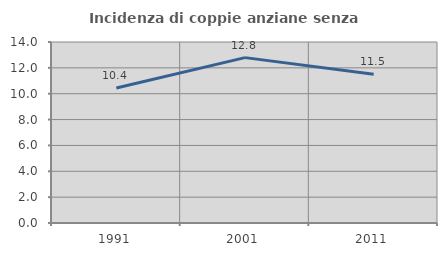
| Category | Incidenza di coppie anziane senza figli  |
|---|---|
| 1991.0 | 10.444 |
| 2001.0 | 12.791 |
| 2011.0 | 11.508 |